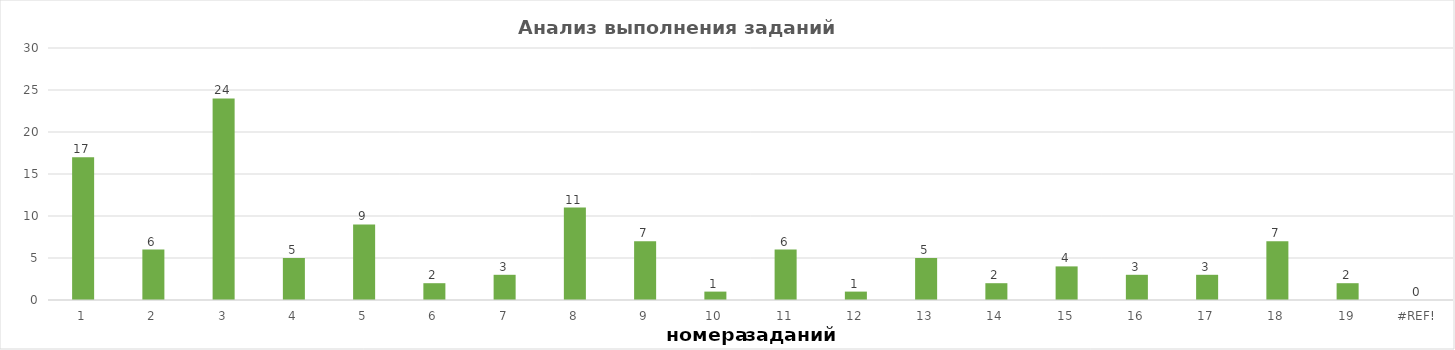
| Category | задания |
|---|---|
| 1.0 | 17 |
| 2.0 | 6 |
| 3.0 | 24 |
| 4.0 | 5 |
| 5.0 | 9 |
| 6.0 | 2 |
| 7.0 | 3 |
| 8.0 | 11 |
| 9.0 | 7 |
| 10.0 | 1 |
| 11.0 | 6 |
| 12.0 | 1 |
| 13.0 | 5 |
| 14.0 | 2 |
| 15.0 | 4 |
| 16.0 | 3 |
| 17.0 | 3 |
| 18.0 | 7 |
| 19.0 | 2 |
| 0.0 | 0 |